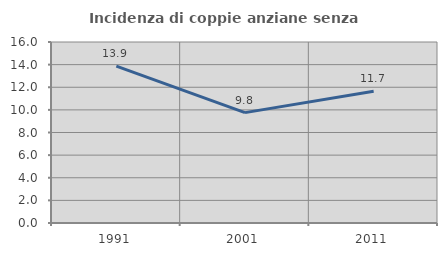
| Category | Incidenza di coppie anziane senza figli  |
|---|---|
| 1991.0 | 13.869 |
| 2001.0 | 9.756 |
| 2011.0 | 11.65 |